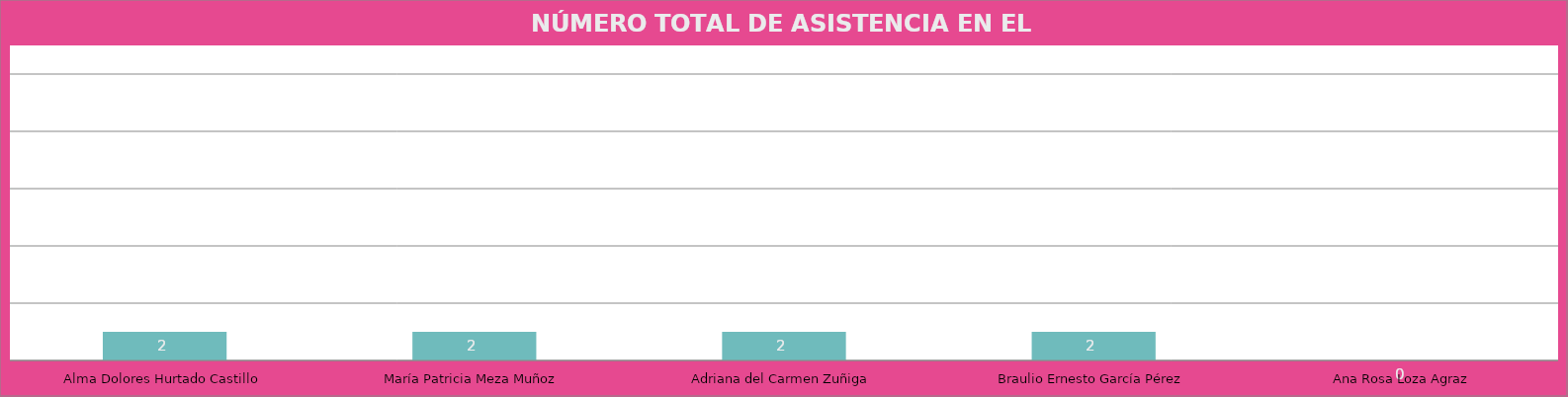
| Category | Alma Dolores Hurtado Castillo |
|---|---|
| Alma Dolores Hurtado Castillo | 2 |
| María Patricia Meza Muñoz | 2 |
| Adriana del Carmen Zuñiga | 2 |
| Braulio Ernesto García Pérez | 2 |
| Ana Rosa Loza Agraz | 0 |